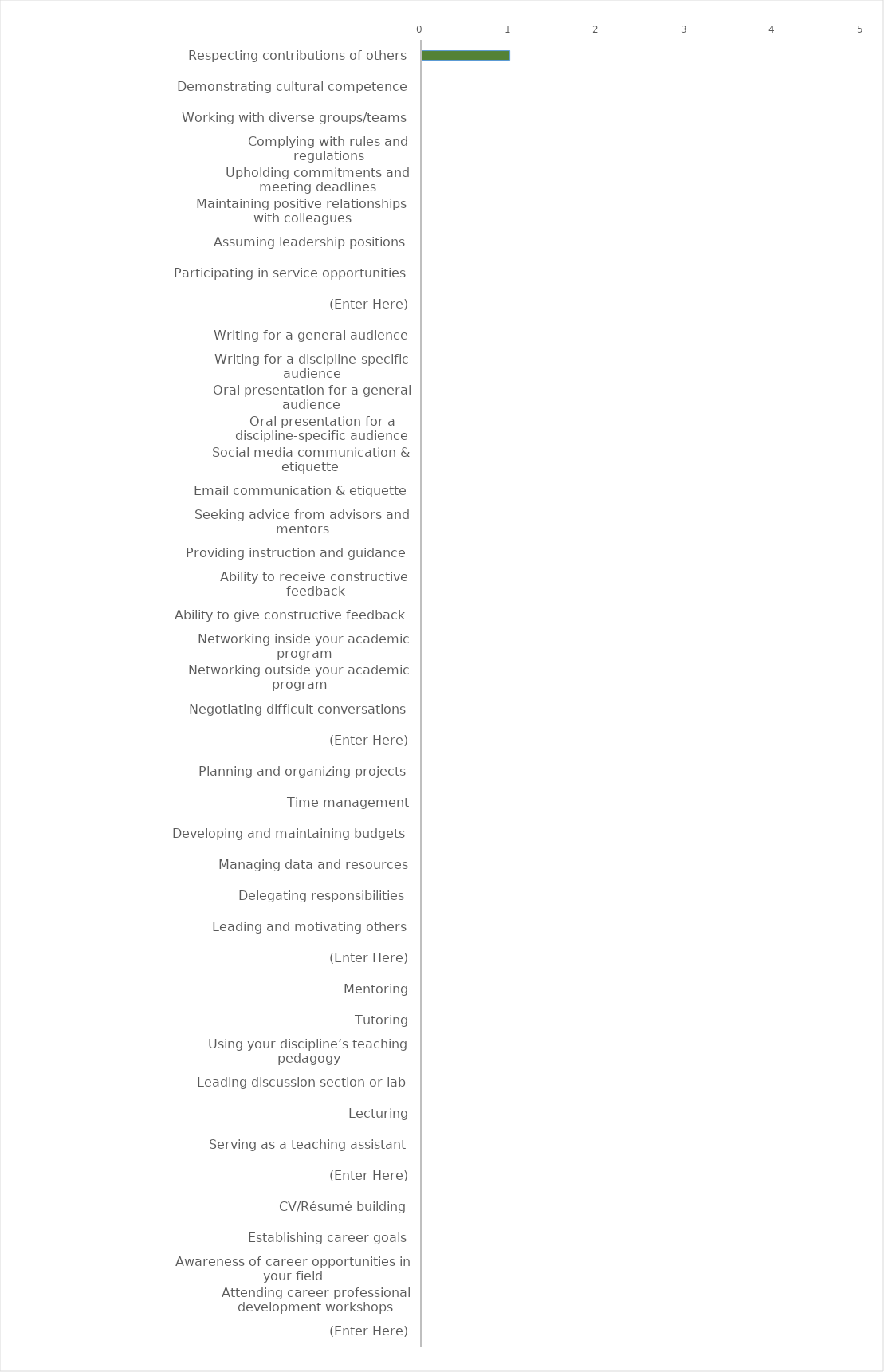
| Category | Series 0 |
|---|---|
| Respecting contributions of others | 1 |
| Demonstrating cultural competence | 0 |
| Working with diverse groups/teams | 0 |
| Complying with rules and regulations | 0 |
| Upholding commitments and meeting deadlines | 0 |
| Maintaining positive relationships with colleagues | 0 |
| Assuming leadership positions | 0 |
| Participating in service opportunities | 0 |
| (Enter Here) | 0 |
| Writing for a general audience | 0 |
| Writing for a discipline-specific audience | 0 |
| Oral presentation for a general audience | 0 |
| Oral presentation for a discipline-specific audience | 0 |
| Social media communication & etiquette | 0 |
| Email communication & etiquette | 0 |
| Seeking advice from advisors and mentors | 0 |
| Providing instruction and guidance | 0 |
| Ability to receive constructive feedback | 0 |
| Ability to give constructive feedback | 0 |
| Networking inside your academic program | 0 |
| Networking outside your academic program | 0 |
| Negotiating difficult conversations | 0 |
| (Enter Here) | 0 |
| Planning and organizing projects | 0 |
| Time management | 0 |
| Developing and maintaining budgets | 0 |
| Managing data and resources | 0 |
| Delegating responsibilities | 0 |
| Leading and motivating others | 0 |
| (Enter Here) | 0 |
| Mentoring | 0 |
| Tutoring | 0 |
| Using your discipline’s teaching pedagogy | 0 |
| Leading discussion section or lab | 0 |
| Lecturing | 0 |
| Serving as a teaching assistant | 0 |
| (Enter Here) | 0 |
| CV/Résumé building | 0 |
| Establishing career goals | 0 |
| Awareness of career opportunities in your field | 0 |
| Attending career professional development workshops | 0 |
| (Enter Here) | 0 |